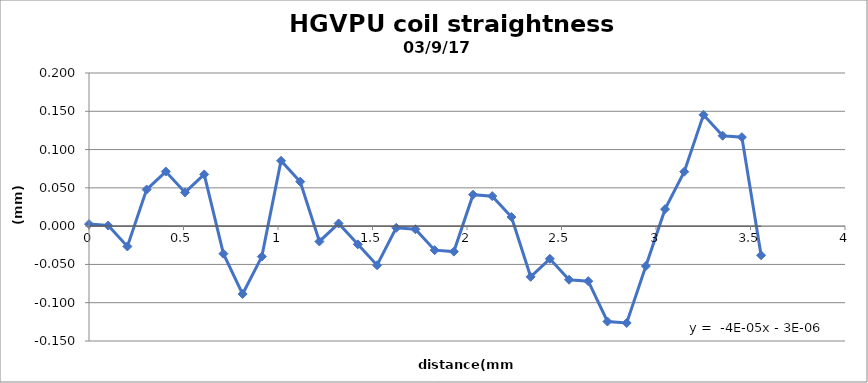
| Category | Set |
|---|---|
| 0.0 | 0.003 |
| 0.1016 | 0.001 |
| 0.2032 | -0.027 |
| 0.30479999999999996 | 0.048 |
| 0.4064 | 0.071 |
| 0.508 | 0.044 |
| 0.6095999999999999 | 0.068 |
| 0.7111999999999999 | -0.036 |
| 0.8128 | -0.089 |
| 0.9144 | -0.04 |
| 1.016 | 0.085 |
| 1.1176 | 0.058 |
| 1.2191999999999998 | -0.02 |
| 1.3208 | 0.004 |
| 1.4223999999999999 | -0.024 |
| 1.524 | -0.051 |
| 1.6256 | -0.002 |
| 1.7271999999999998 | -0.004 |
| 1.8288 | -0.031 |
| 1.9304 | -0.033 |
| 2.032 | 0.041 |
| 2.1336 | 0.039 |
| 2.2352 | 0.012 |
| 2.3367999999999998 | -0.066 |
| 2.4383999999999997 | -0.043 |
| 2.54 | -0.07 |
| 2.6416 | -0.072 |
| 2.7432 | -0.125 |
| 2.8447999999999998 | -0.126 |
| 2.9463999999999997 | -0.052 |
| 3.048 | 0.022 |
| 3.1496 | 0.071 |
| 3.2512 | 0.145 |
| 3.3528 | 0.118 |
| 3.4543999999999997 | 0.116 |
| 3.556 | -0.038 |